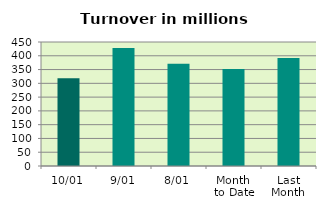
| Category | Series 0 |
|---|---|
| 10/01 | 318.64 |
| 9/01 | 428.199 |
| 8/01 | 371.439 |
| Month 
to Date | 352.087 |
| Last
Month | 391.769 |